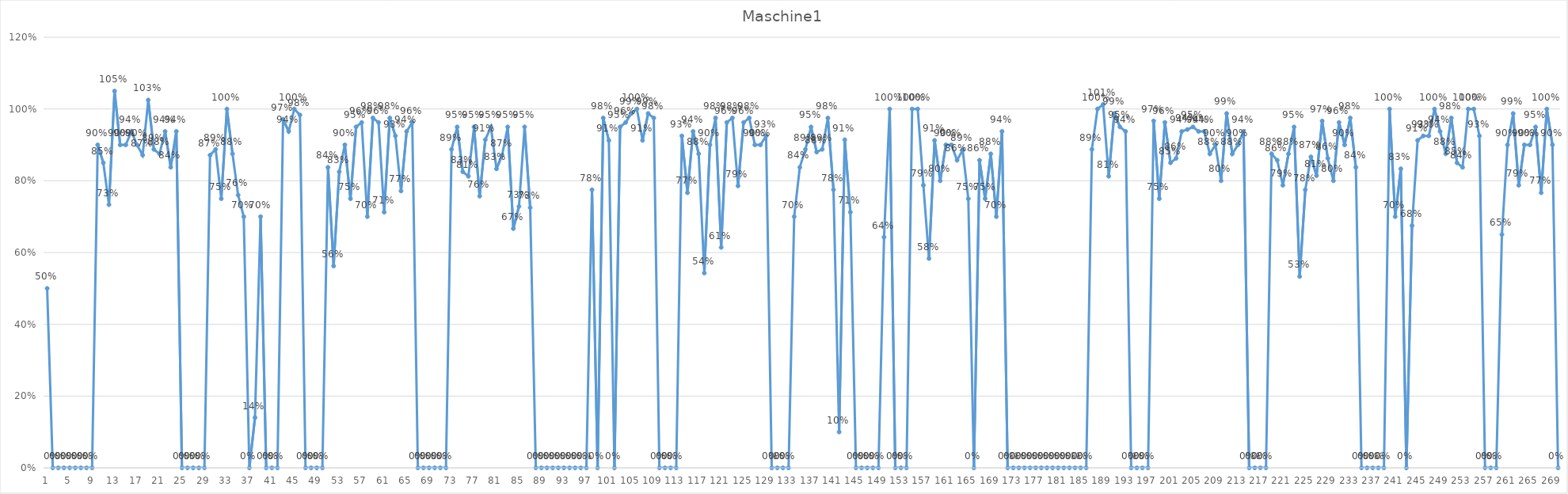
| Category | Maschine1 |
|---|---|
| 0 | 0.5 |
| 1 | 0 |
| 2 | 0 |
| 3 | 0 |
| 4 | 0 |
| 5 | 0 |
| 6 | 0 |
| 7 | 0 |
| 8 | 0 |
| 9 | 0.9 |
| 10 | 0.85 |
| 11 | 0.733 |
| 12 | 1.05 |
| 13 | 0.9 |
| 14 | 0.9 |
| 15 | 0.938 |
| 16 | 0.9 |
| 17 | 0.871 |
| 18 | 1.025 |
| 19 | 0.888 |
| 20 | 0.875 |
| 21 | 0.938 |
| 22 | 0.838 |
| 23 | 0.938 |
| 24 | 0 |
| 25 | 0 |
| 26 | 0 |
| 27 | 0 |
| 28 | 0 |
| 29 | 0.871 |
| 30 | 0.888 |
| 31 | 0.75 |
| 32 | 1 |
| 33 | 0.875 |
| 34 | 0.76 |
| 35 | 0.7 |
| 36 | 0 |
| 37 | 0.14 |
| 38 | 0.7 |
| 39 | 0 |
| 40 | 0 |
| 41 | 0 |
| 42 | 0.971 |
| 43 | 0.938 |
| 44 | 1 |
| 45 | 0.983 |
| 46 | 0 |
| 47 | 0 |
| 48 | 0 |
| 49 | 0 |
| 50 | 0.837 |
| 51 | 0.562 |
| 52 | 0.825 |
| 53 | 0.9 |
| 54 | 0.75 |
| 55 | 0.95 |
| 56 | 0.962 |
| 57 | 0.7 |
| 58 | 0.975 |
| 59 | 0.962 |
| 60 | 0.712 |
| 61 | 0.975 |
| 62 | 0.925 |
| 63 | 0.771 |
| 64 | 0.938 |
| 65 | 0.962 |
| 66 | 0 |
| 67 | 0 |
| 68 | 0 |
| 69 | 0 |
| 70 | 0 |
| 71 | 0 |
| 72 | 0.888 |
| 73 | 0.95 |
| 74 | 0.825 |
| 75 | 0.812 |
| 76 | 0.95 |
| 77 | 0.757 |
| 78 | 0.914 |
| 79 | 0.95 |
| 80 | 0.833 |
| 81 | 0.871 |
| 82 | 0.95 |
| 83 | 0.667 |
| 84 | 0.729 |
| 85 | 0.95 |
| 86 | 0.725 |
| 87 | 0 |
| 88 | 0 |
| 89 | 0 |
| 90 | 0 |
| 91 | 0 |
| 92 | 0 |
| 93 | 0 |
| 94 | 0 |
| 95 | 0 |
| 96 | 0 |
| 97 | 0.775 |
| 98 | 0 |
| 99 | 0.975 |
| 100 | 0.912 |
| 101 | 0 |
| 102 | 0.95 |
| 103 | 0.962 |
| 104 | 0.988 |
| 105 | 1 |
| 106 | 0.912 |
| 107 | 0.988 |
| 108 | 0.975 |
| 109 | 0 |
| 110 | 0 |
| 111 | 0 |
| 112 | 0 |
| 113 | 0.925 |
| 114 | 0.767 |
| 115 | 0.938 |
| 116 | 0.875 |
| 117 | 0.543 |
| 118 | 0.9 |
| 119 | 0.975 |
| 120 | 0.614 |
| 121 | 0.962 |
| 122 | 0.975 |
| 123 | 0.786 |
| 124 | 0.962 |
| 125 | 0.975 |
| 126 | 0.9 |
| 127 | 0.9 |
| 128 | 0.925 |
| 129 | 0 |
| 130 | 0 |
| 131 | 0 |
| 132 | 0 |
| 133 | 0.7 |
| 134 | 0.838 |
| 135 | 0.888 |
| 136 | 0.95 |
| 137 | 0.88 |
| 138 | 0.888 |
| 139 | 0.975 |
| 140 | 0.775 |
| 141 | 0.1 |
| 142 | 0.914 |
| 143 | 0.712 |
| 144 | 0 |
| 145 | 0 |
| 146 | 0 |
| 147 | 0 |
| 148 | 0 |
| 149 | 0.643 |
| 150 | 1 |
| 151 | 0 |
| 152 | 0 |
| 153 | 0 |
| 154 | 1 |
| 155 | 1 |
| 156 | 0.788 |
| 157 | 0.583 |
| 158 | 0.913 |
| 159 | 0.8 |
| 160 | 0.9 |
| 161 | 0.9 |
| 162 | 0.857 |
| 163 | 0.886 |
| 164 | 0.75 |
| 165 | 0 |
| 166 | 0.857 |
| 167 | 0.75 |
| 168 | 0.875 |
| 169 | 0.7 |
| 170 | 0.938 |
| 171 | 0 |
| 172 | 0 |
| 173 | 0 |
| 174 | 0 |
| 175 | 0 |
| 176 | 0 |
| 177 | 0 |
| 178 | 0 |
| 179 | 0 |
| 180 | 0 |
| 181 | 0 |
| 182 | 0 |
| 183 | 0 |
| 184 | 0 |
| 185 | 0 |
| 186 | 0.888 |
| 187 | 1 |
| 188 | 1.012 |
| 189 | 0.812 |
| 190 | 0.988 |
| 191 | 0.95 |
| 192 | 0.938 |
| 193 | 0 |
| 194 | 0 |
| 195 | 0 |
| 196 | 0 |
| 197 | 0.967 |
| 198 | 0.75 |
| 199 | 0.962 |
| 200 | 0.85 |
| 201 | 0.862 |
| 202 | 0.938 |
| 203 | 0.943 |
| 204 | 0.95 |
| 205 | 0.938 |
| 206 | 0.938 |
| 207 | 0.875 |
| 208 | 0.9 |
| 209 | 0.8 |
| 210 | 0.988 |
| 211 | 0.875 |
| 212 | 0.9 |
| 213 | 0.938 |
| 214 | 0 |
| 215 | 0 |
| 216 | 0 |
| 217 | 0 |
| 218 | 0.875 |
| 219 | 0.857 |
| 220 | 0.788 |
| 221 | 0.875 |
| 222 | 0.95 |
| 223 | 0.533 |
| 224 | 0.775 |
| 225 | 0.867 |
| 226 | 0.814 |
| 227 | 0.967 |
| 228 | 0.862 |
| 229 | 0.8 |
| 230 | 0.962 |
| 231 | 0.9 |
| 232 | 0.975 |
| 233 | 0.838 |
| 234 | 0 |
| 235 | 0 |
| 236 | 0 |
| 237 | 0 |
| 238 | 0 |
| 239 | 1 |
| 240 | 0.7 |
| 241 | 0.833 |
| 242 | 0 |
| 243 | 0.675 |
| 244 | 0.912 |
| 245 | 0.925 |
| 246 | 0.925 |
| 247 | 1 |
| 248 | 0.938 |
| 249 | 0.875 |
| 250 | 0.975 |
| 251 | 0.85 |
| 252 | 0.838 |
| 253 | 1 |
| 254 | 1 |
| 255 | 0.925 |
| 256 | 0 |
| 257 | 0 |
| 258 | 0 |
| 259 | 0.65 |
| 260 | 0.9 |
| 261 | 0.988 |
| 262 | 0.788 |
| 263 | 0.9 |
| 264 | 0.9 |
| 265 | 0.95 |
| 266 | 0.767 |
| 267 | 1 |
| 268 | 0.9 |
| 269 | 0 |